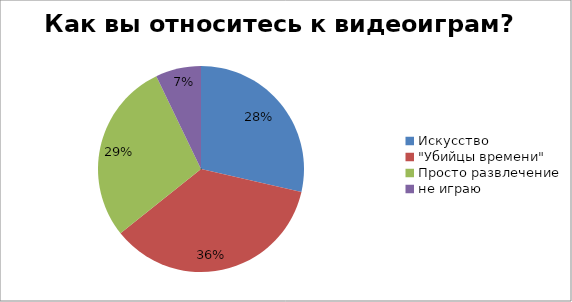
| Category | Series 0 |
|---|---|
| Искусство | 4 |
| "Убийцы времени" | 5 |
| Просто развлечение | 4 |
| не играю | 1 |